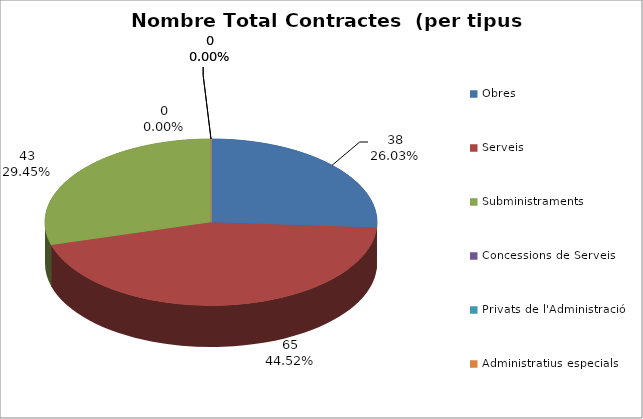
| Category | Nombre Total Contractes |
|---|---|
| Obres | 38 |
| Serveis | 65 |
| Subministraments | 43 |
| Concessions de Serveis | 0 |
| Privats de l'Administració | 0 |
| Administratius especials | 0 |